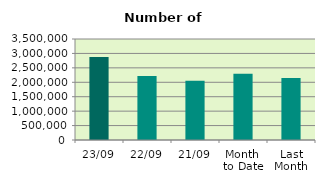
| Category | Series 0 |
|---|---|
| 23/09 | 2876840 |
| 22/09 | 2218908 |
| 21/09 | 2052142 |
| Month 
to Date | 2292721.412 |
| Last
Month | 2149140 |